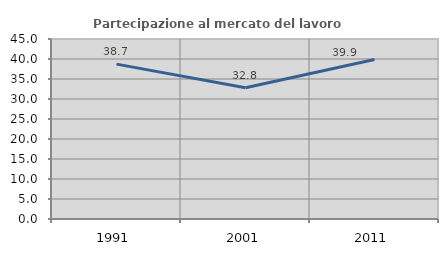
| Category | Partecipazione al mercato del lavoro  femminile |
|---|---|
| 1991.0 | 38.723 |
| 2001.0 | 32.801 |
| 2011.0 | 39.877 |